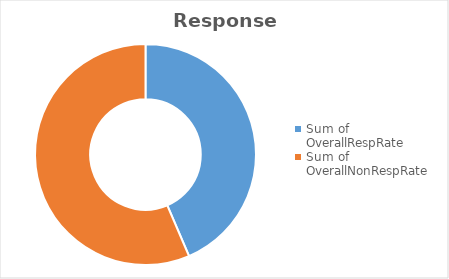
| Category | Total |
|---|---|
| Sum of OverallRespRate | 43.557 |
| Sum of OverallNonRespRate | 56.443 |